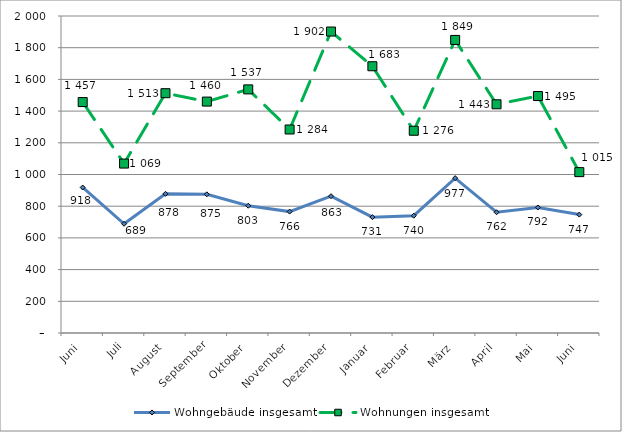
| Category | Wohngebäude insgesamt | Wohnungen insgesamt |
|---|---|---|
| Juni | 918 | 1457 |
| Juli | 689 | 1069 |
| August | 878 | 1513 |
| September | 875 | 1460 |
| Oktober | 803 | 1537 |
| November | 766 | 1284 |
| Dezember | 863 | 1902 |
| Januar | 731 | 1683 |
| Februar | 740 | 1276 |
| März | 977 | 1849 |
| April | 762 | 1443 |
| Mai | 792 | 1495 |
| Juni | 747 | 1015 |